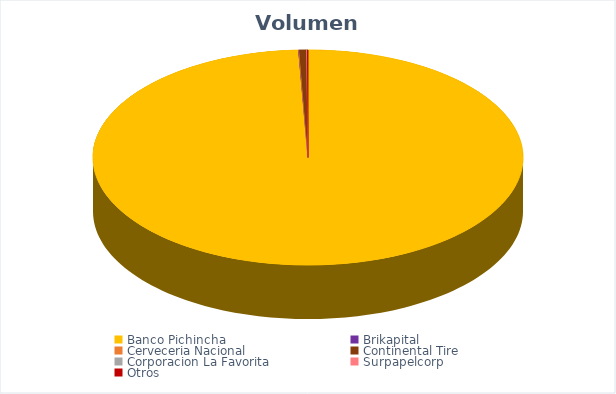
| Category | VOLUMEN ($USD) |
|---|---|
| Banco Pichincha | 8634900 |
| Brikapital | 3000 |
| Cerveceria Nacional | 2640 |
| Continental Tire | 50000 |
| Corporacion La Favorita | 1092 |
| Surpapelcorp | 114.75 |
| Otros | 6288 |